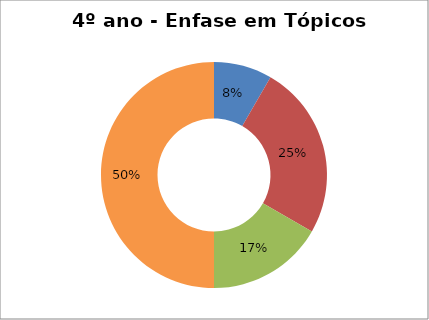
| Category | Series 0 |
|---|---|
| Prog | 1 |
| Tec | 3 |
| MeT | 2 |
| Prof | 6 |